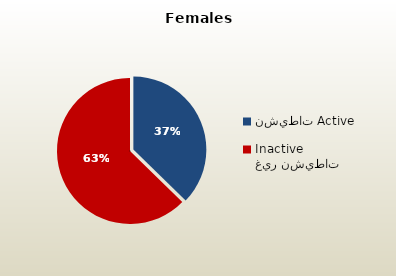
| Category | الاناث القطريات  Qatari Females |
|---|---|
| نشيطات Active | 40768 |
| غير نشيطات Inactive | 68544 |